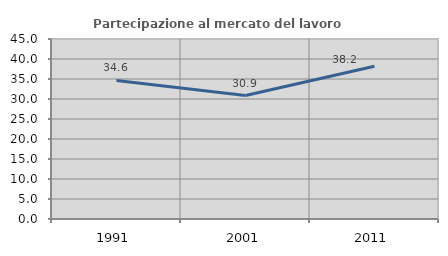
| Category | Partecipazione al mercato del lavoro  femminile |
|---|---|
| 1991.0 | 34.648 |
| 2001.0 | 30.871 |
| 2011.0 | 38.196 |